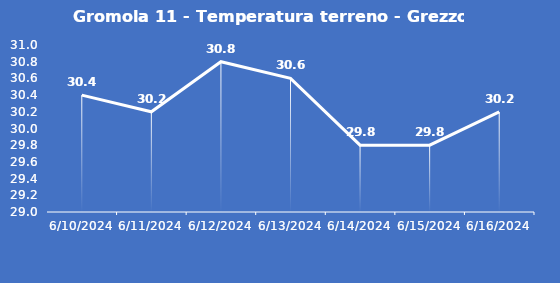
| Category | Gromola 11 - Temperatura terreno - Grezzo (°C) |
|---|---|
| 6/10/24 | 30.4 |
| 6/11/24 | 30.2 |
| 6/12/24 | 30.8 |
| 6/13/24 | 30.6 |
| 6/14/24 | 29.8 |
| 6/15/24 | 29.8 |
| 6/16/24 | 30.2 |